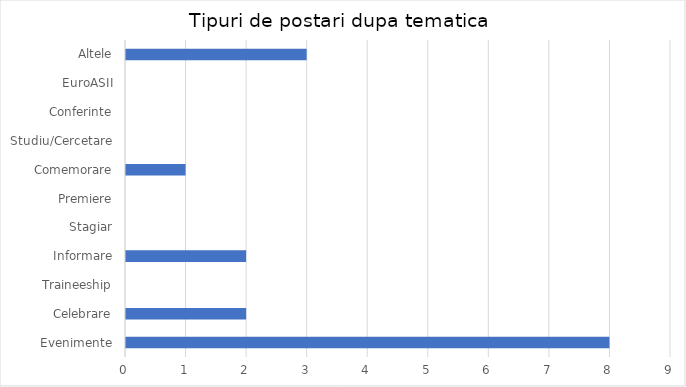
| Category | Series 0 |
|---|---|
| Evenimente | 8 |
| Celebrare | 2 |
| Traineeship | 0 |
| Informare | 2 |
| Stagiar | 0 |
| Premiere | 0 |
| Comemorare | 1 |
| Studiu/Cercetare | 0 |
| Conferinte | 0 |
| EuroASII | 0 |
| Altele | 3 |